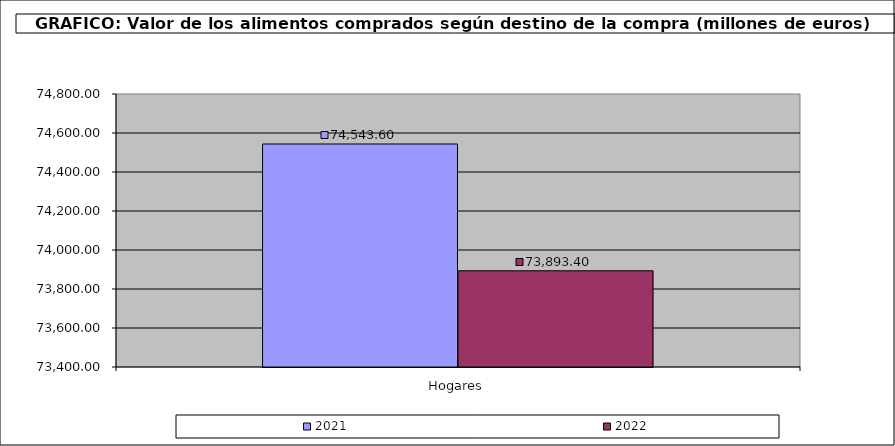
| Category | 2021 | 2022 |
|---|---|---|
| 0 | 74543.604 | 73893.395 |